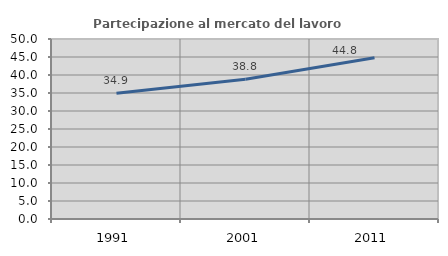
| Category | Partecipazione al mercato del lavoro  femminile |
|---|---|
| 1991.0 | 34.933 |
| 2001.0 | 38.798 |
| 2011.0 | 44.782 |